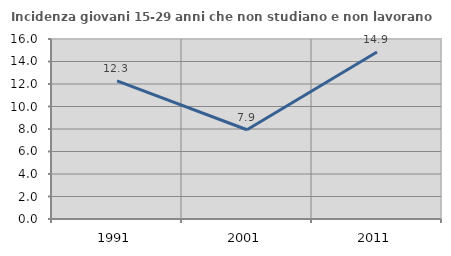
| Category | Incidenza giovani 15-29 anni che non studiano e non lavorano  |
|---|---|
| 1991.0 | 12.278 |
| 2001.0 | 7.933 |
| 2011.0 | 14.851 |